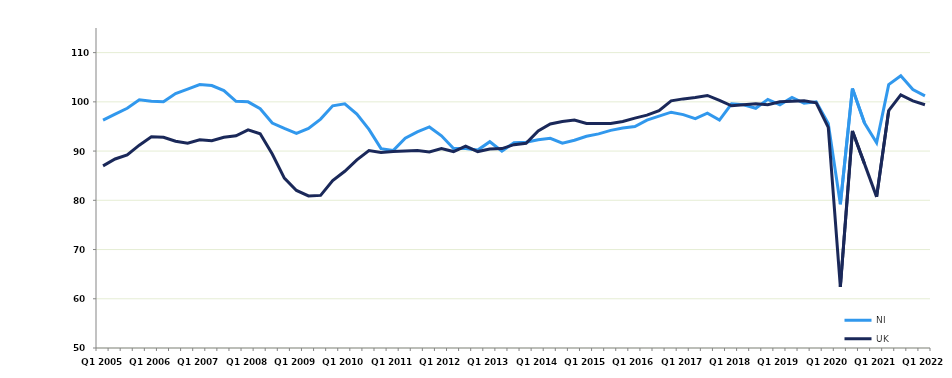
| Category | NI | UK |
|---|---|---|
| Q1 2005 | 96.3 | 87 |
|  | 97.5 | 88.4 |
|  | 98.7 | 89.2 |
|  | 100.4 | 91.2 |
| Q1 2006 | 100.1 | 92.9 |
|  | 100 | 92.8 |
|  | 101.7 | 92 |
|  | 102.6 | 91.6 |
| Q1 2007 | 103.5 | 92.3 |
|  | 103.3 | 92.1 |
|  | 102.3 | 92.8 |
|  | 100.1 | 93.1 |
| Q1 2008 | 100 | 94.3 |
|  | 98.6 | 93.5 |
|  | 95.7 | 89.4 |
|  | 94.6 | 84.5 |
| Q1 2009 | 93.6 | 82 |
|  | 94.6 | 80.9 |
|  | 96.5 | 81 |
|  | 99.2 | 84 |
| Q1 2010 | 99.6 | 85.9 |
|  | 97.5 | 88.2 |
|  | 94.4 | 90.1 |
|  | 90.5 | 89.7 |
| Q1 2011 | 90.1 | 89.9 |
|  | 92.6 | 90 |
|  | 93.9 | 90.1 |
|  | 94.9 | 89.8 |
| Q1 2012 | 93.1 | 90.5 |
|  | 90.5 | 89.9 |
|  | 90.5 | 91 |
|  | 90.2 | 89.9 |
| Q1 2013 | 91.9 | 90.4 |
|  | 90 | 90.5 |
|  | 91.7 | 91.3 |
|  | 91.8 | 91.6 |
| Q1 2014 | 92.3 | 94.1 |
|  | 92.6 | 95.5 |
|  | 91.6 | 96 |
|  | 92.2 | 96.3 |
| Q1 2015 | 93 | 95.6 |
|  | 93.5 | 95.6 |
|  | 94.2 | 95.6 |
|  | 94.7 | 96 |
| Q1 2016 | 95 | 96.7 |
|  | 96.3 | 97.3 |
|  | 97.1 | 98.2 |
|  | 97.9 | 100.2 |
| Q1 2017 | 97.4 | 100.6 |
|  | 96.6 | 100.9 |
|  | 97.7 | 101.3 |
|  | 96.3 | 100.3 |
| Q1 2018 | 99.6 | 99.2 |
|  | 99.4 | 99.4 |
|  | 98.7 | 99.6 |
|  | 100.5 | 99.4 |
| Q1 2019 | 99.4 | 100 |
|  | 100.9 | 100.1 |
|  | 99.7 | 100.2 |
|  | 100 | 99.8 |
| Q1 2020 | 95.6 | 94.8 |
|  | 79.2 | 62.4 |
|  | 102.7 | 94.1 |
|  | 95.7 | 87.4 |
| Q1 2021 | 91.7 | 80.7 |
|  | 103.5 | 98.2 |
|  | 105.3 | 101.4 |
|  | 102.5 | 100.2 |
| Q1 2022 | 101.2 | 99.4 |